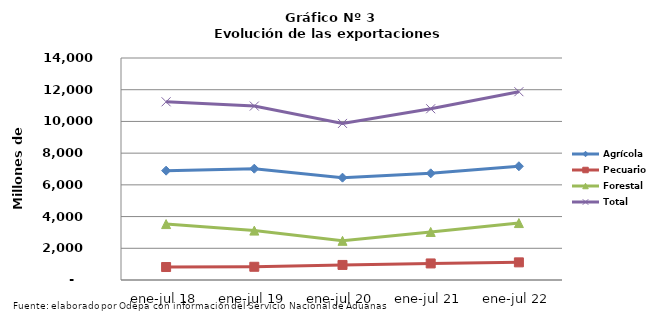
| Category | Agrícola | Pecuario | Forestal | Total |
|---|---|---|---|---|
| ene-jul 18 | 6895172 | 817867 | 3525647 | 11238686 |
| ene-jul 19 | 7019567 | 833636 | 3115566 | 10968769 |
| ene-jul 20 | 6453387 | 950672 | 2470795 | 9874854 |
| ene-jul 21 | 6726231 | 1043892 | 3030085 | 10800208 |
| ene-jul 22 | 7173228 | 1112132 | 3589771 | 11875131 |